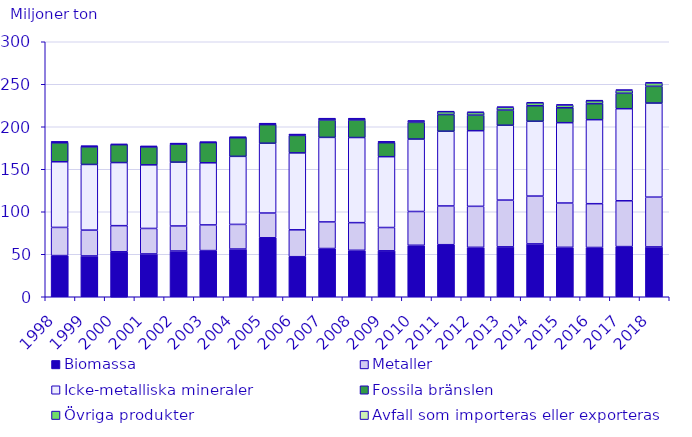
| Category | Biomassa | Metaller | Icke-metalliska mineraler | Fossila bränslen | Övriga produkter | Avfall som importeras eller exporteras |
|---|---|---|---|---|---|---|
| 1998.0 | 48.45 | 33.124 | 77.234 | 22.307 | 1.083 | 0 |
| 1999.0 | 48.012 | 30.373 | 77.263 | 20.74 | 0.784 | 0 |
| 2000.0 | 52.89 | 30.749 | 74.22 | 21.066 | 0.882 | 0 |
| 2001.0 | 50.374 | 29.982 | 74.843 | 21.147 | 0.553 | 0 |
| 2002.0 | 53.847 | 29.421 | 75.081 | 21.298 | 0.531 | 0.002 |
| 2003.0 | 54.338 | 30.173 | 73.097 | 23.796 | 0.472 | 0.002 |
| 2004.0 | 56.122 | 28.995 | 80.051 | 21.838 | 0.702 | 0.002 |
| 2005.0 | 69.388 | 29.115 | 82.129 | 21.876 | 1.108 | 0.017 |
| 2006.0 | 47.124 | 31.629 | 90.495 | 20.558 | 1.006 | 0.008 |
| 2007.0 | 56.748 | 31.276 | 99.466 | 20.378 | 1.629 | 0.013 |
| 2008.0 | 54.644 | 32.553 | 100.126 | 20.614 | 1.537 | 0.027 |
| 2009.0 | 54.055 | 27.403 | 83.328 | 16.476 | 1.024 | 0.156 |
| 2010.0 | 60.553 | 39.747 | 85.219 | 19.63 | 1.573 | 0.29 |
| 2011.0 | 61.241 | 45.578 | 87.908 | 19.643 | 3.384 | 0.46 |
| 2012.0 | 58.132 | 48.252 | 88.97 | 18.269 | 3.263 | 0.534 |
| 2013.0 | 58.707 | 55.01 | 88.057 | 17.798 | 3.334 | 0.56 |
| 2014.0 | 62.179 | 56.273 | 88.018 | 18.189 | 3.507 | 0.667 |
| 2015.0 | 58.157 | 52.13 | 94.499 | 17.548 | 3.187 | 0.671 |
| 2016.0 | 57.97 | 51.509 | 98.845 | 18.861 | 3.379 | 0.712 |
| 2017.0 | 58.993 | 53.923 | 108.313 | 18.144 | 3.511 | 0.756 |
| 2018.0 | 58.626 | 58.546 | 110.679 | 19.708 | 3.934 | 0.737 |